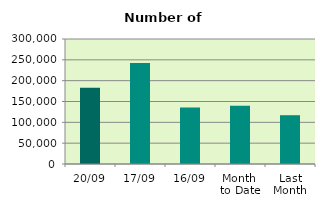
| Category | Series 0 |
|---|---|
| 20/09 | 183006 |
| 17/09 | 242416 |
| 16/09 | 135794 |
| Month 
to Date | 139539.429 |
| Last
Month | 117090.273 |